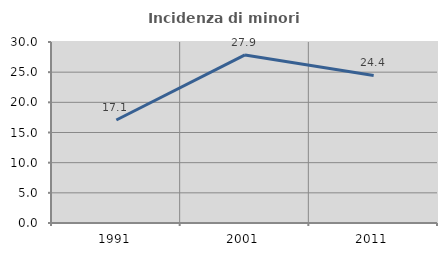
| Category | Incidenza di minori stranieri |
|---|---|
| 1991.0 | 17.073 |
| 2001.0 | 27.857 |
| 2011.0 | 24.449 |